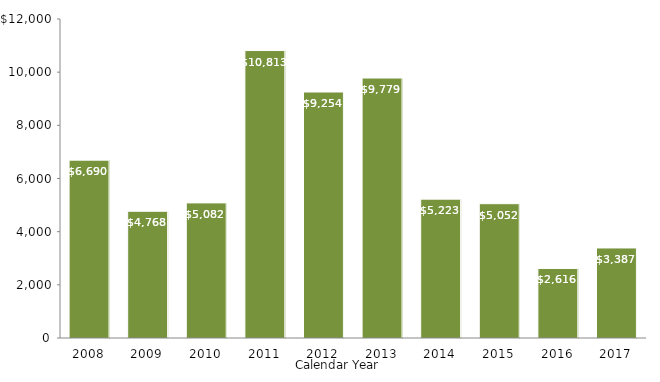
| Category | Series 1 |
|---|---|
| 2008.0 | 6690 |
| 2009.0 | 4768 |
| 2010.0 | 5082 |
| 2011.0 | 10813 |
| 2012.0 | 9254 |
| 2013.0 | 9779 |
| 2014.0 | 5223 |
| 2015.0 | 5052.294 |
| 2016.0 | 2616.039 |
| 2017.0 | 3387 |